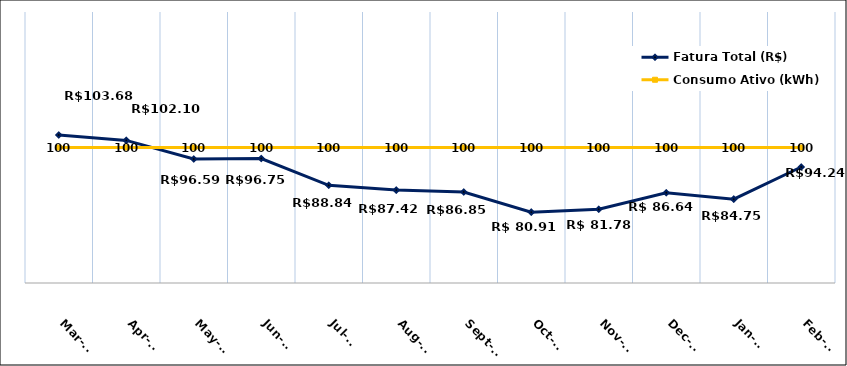
| Category | Fatura Total (R$) |
|---|---|
| 2022-03-01 | 103.68 |
| 2022-04-01 | 102.1 |
| 2022-05-01 | 96.59 |
| 2022-06-01 | 96.75 |
| 2022-07-01 | 88.84 |
| 2022-08-01 | 87.42 |
| 2022-09-01 | 86.85 |
| 2022-10-01 | 80.91 |
| 2022-11-01 | 81.78 |
| 2022-12-01 | 86.64 |
| 2023-01-01 | 84.75 |
| 2023-02-01 | 94.24 |